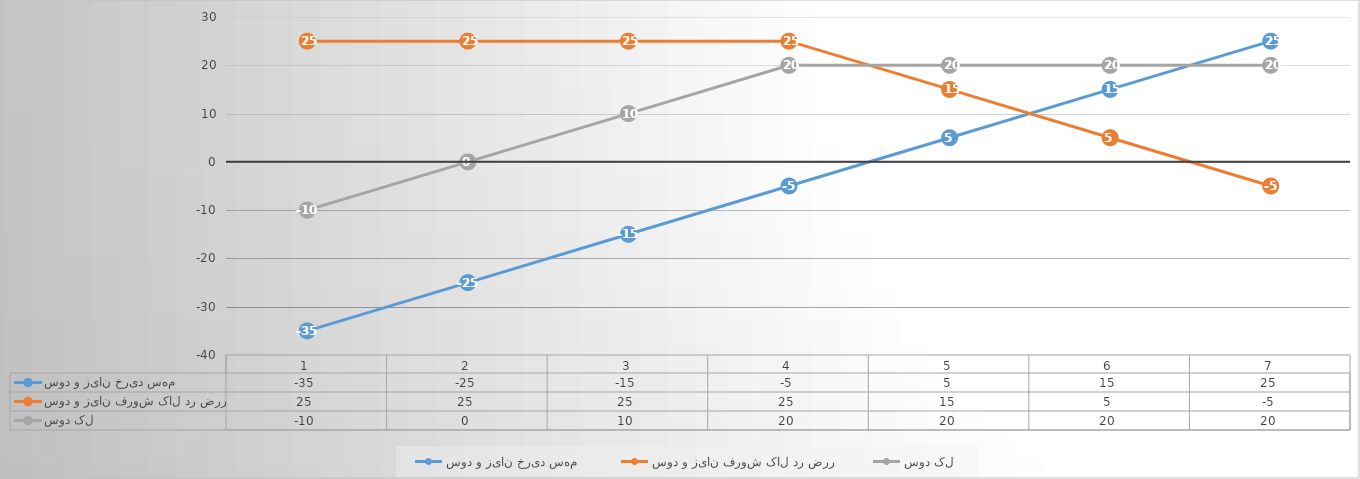
| Category | سود و زیان خرید سهم  | سود و زیان فروش کال در ضرر | سود کل |
|---|---|---|---|
| 0 | -35 | 25 | -10 |
| 1 | -25 | 25 | 0 |
| 2 | -15 | 25 | 10 |
| 3 | -5 | 25 | 20 |
| 4 | 5 | 15 | 20 |
| 5 | 15 | 5 | 20 |
| 6 | 25 | -5 | 20 |